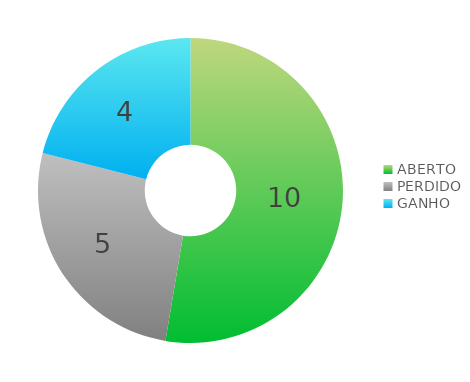
| Category | Series 0 |
|---|---|
| ABERTO | 10 |
| PERDIDO | 5 |
| GANHO | 4 |